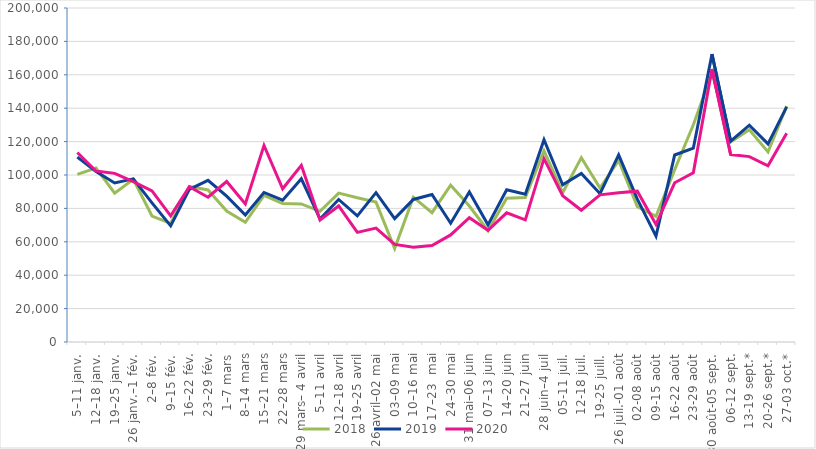
| Category | 2018 | 2019 | 2020 |
|---|---|---|---|
| 5–11 janv. | 100330 | 110701 | 113506 |
| 12–18 janv. | 104190 | 102045 | 102407 |
| 19–25 janv. | 89142 | 95260 | 100966 |
| 26 janv.–1 fév. | 97441 | 97699 | 96042 |
| 2–8 fév. | 75434 | 83347 | 90495 |
| 9–15 fév. | 71031 | 69559 | 75523 |
| 16–22 fév. | 93102 | 91428 | 93003 |
| 23–29 fév. | 91065 | 96774 | 86699 |
| 1–7 mars | 78415 | 87314 | 96119 |
| 8–14 mars | 71697 | 76021 | 82690 |
| 15–21 mars | 87845 | 89536 | 117673 |
| 22–28 mars | 82895 | 84912 | 91763.636 |
| 29 mars– 4 avril | 82654 | 97699 | 105802 |
| 5–11 avril | 78244 | 73699 | 73060.606 |
| 12–18 avril | 89129 | 85348 | 81477 |
| 19–25 avril | 86398 | 75509 | 65653 |
| 26 avril–02 mai | 83743 | 89413 | 68188 |
| 03–09 mai | 56008 | 73891 | 58423 |
| 10–16 mai | 86722 | 85364 | 56762 |
| 17–23  mai | 77423 | 88345 | 57817 |
| 24–30 mai | 93888 | 71115 | 64117 |
| 31 mai–06 juin | 81416 | 89880 | 74412 |
| 07–13 juin | 66658 | 70150 | 66851 |
| 14–20 juin | 86057 | 91157 | 77340 |
| 21–27 juin | 86474 | 88454 | 73165 |
| 28 juin–4 juil | 114502 | 121118 | 109774 |
| 05-11 juil. | 89389 | 94137 | 87596 |
| 12-18 juil. | 110384 | 100940 | 78915 |
| 19-25 juill. | 92231 | 88807 | 88097 |
| 26 juil.-01 août | 108699 | 112047 | 89418 |
| 02-08 août | 81067 | 85538 | 90304 |
| 09-15 août | 75229 | 63347 | 70433 |
| 16-22 août | 103158 | 111994 | 95333 |
| 23-29 août | 130053 | 116047 | 101359 |
| 30 août-05 sept. | 161020 | 172405 | 163439 |
| 06-12 sept. | 119903 | 120244 | 112241 |
| 13-19 sept.* | 127142 | 129807 | 111025 |
| 20-26 sept.* | 113803 | 118640 | 105487 |
| 27-03 oct.* | 141252 | 140820 | 124977 |